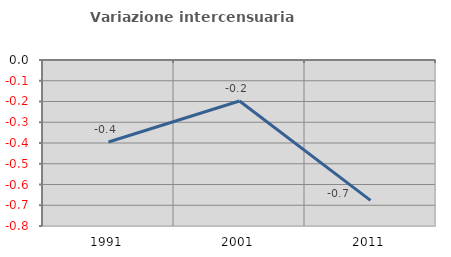
| Category | Variazione intercensuaria annua |
|---|---|
| 1991.0 | -0.395 |
| 2001.0 | -0.197 |
| 2011.0 | -0.677 |